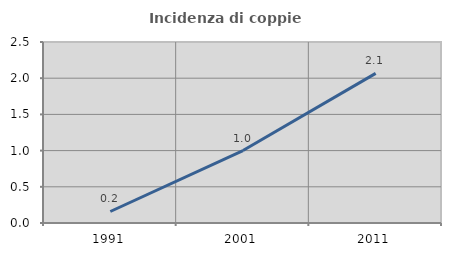
| Category | Incidenza di coppie miste |
|---|---|
| 1991.0 | 0.159 |
| 2001.0 | 1.001 |
| 2011.0 | 2.066 |